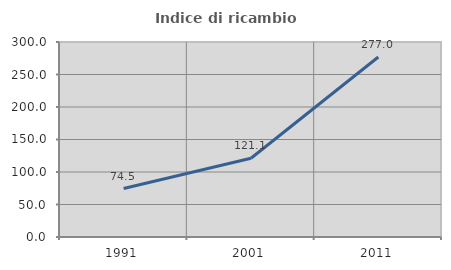
| Category | Indice di ricambio occupazionale  |
|---|---|
| 1991.0 | 74.501 |
| 2001.0 | 121.116 |
| 2011.0 | 276.97 |